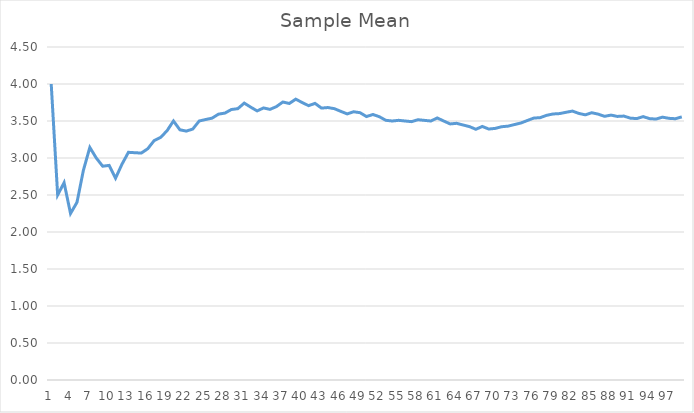
| Category | Series 0 |
|---|---|
| 0 | 4 |
| 1 | 2.5 |
| 2 | 2.667 |
| 3 | 2.25 |
| 4 | 2.4 |
| 5 | 2.833 |
| 6 | 3.143 |
| 7 | 3 |
| 8 | 2.889 |
| 9 | 2.9 |
| 10 | 2.727 |
| 11 | 2.917 |
| 12 | 3.077 |
| 13 | 3.071 |
| 14 | 3.067 |
| 15 | 3.125 |
| 16 | 3.235 |
| 17 | 3.278 |
| 18 | 3.368 |
| 19 | 3.5 |
| 20 | 3.381 |
| 21 | 3.364 |
| 22 | 3.391 |
| 23 | 3.5 |
| 24 | 3.52 |
| 25 | 3.538 |
| 26 | 3.593 |
| 27 | 3.607 |
| 28 | 3.655 |
| 29 | 3.667 |
| 30 | 3.742 |
| 31 | 3.688 |
| 32 | 3.636 |
| 33 | 3.676 |
| 34 | 3.657 |
| 35 | 3.694 |
| 36 | 3.757 |
| 37 | 3.737 |
| 38 | 3.795 |
| 39 | 3.75 |
| 40 | 3.707 |
| 41 | 3.738 |
| 42 | 3.674 |
| 43 | 3.682 |
| 44 | 3.667 |
| 45 | 3.63 |
| 46 | 3.596 |
| 47 | 3.625 |
| 48 | 3.612 |
| 49 | 3.56 |
| 50 | 3.588 |
| 51 | 3.558 |
| 52 | 3.509 |
| 53 | 3.5 |
| 54 | 3.509 |
| 55 | 3.5 |
| 56 | 3.491 |
| 57 | 3.517 |
| 58 | 3.508 |
| 59 | 3.5 |
| 60 | 3.541 |
| 61 | 3.5 |
| 62 | 3.46 |
| 63 | 3.469 |
| 64 | 3.446 |
| 65 | 3.424 |
| 66 | 3.388 |
| 67 | 3.426 |
| 68 | 3.391 |
| 69 | 3.4 |
| 70 | 3.423 |
| 71 | 3.431 |
| 72 | 3.452 |
| 73 | 3.473 |
| 74 | 3.507 |
| 75 | 3.539 |
| 76 | 3.545 |
| 77 | 3.577 |
| 78 | 3.595 |
| 79 | 3.6 |
| 80 | 3.617 |
| 81 | 3.634 |
| 82 | 3.602 |
| 83 | 3.583 |
| 84 | 3.612 |
| 85 | 3.593 |
| 86 | 3.563 |
| 87 | 3.58 |
| 88 | 3.562 |
| 89 | 3.567 |
| 90 | 3.538 |
| 91 | 3.533 |
| 92 | 3.559 |
| 93 | 3.532 |
| 94 | 3.526 |
| 95 | 3.552 |
| 96 | 3.536 |
| 97 | 3.531 |
| 98 | 3.556 |